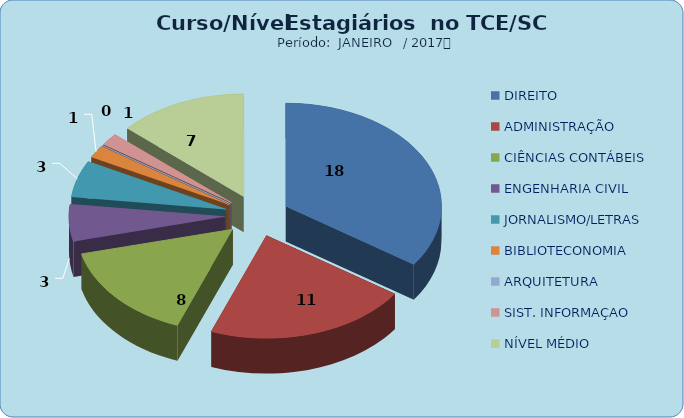
| Category | Series 0 |
|---|---|
| DIREITO | 18 |
| ADMINISTRAÇÃO | 11 |
| CIÊNCIAS CONTÁBEIS | 8 |
| ENGENHARIA CIVIL | 3 |
| JORNALISMO/LETRAS | 3 |
| BIBLIOTECONOMIA | 1 |
| ARQUITETURA | 0 |
| SIST. INFORMAÇAO | 1 |
| NÍVEL MÉDIO | 7 |